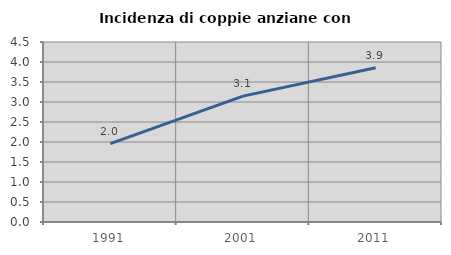
| Category | Incidenza di coppie anziane con figli |
|---|---|
| 1991.0 | 1.961 |
| 2001.0 | 3.147 |
| 2011.0 | 3.855 |